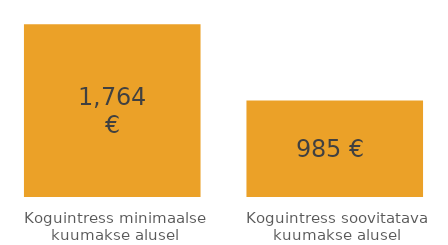
| Category | Series 0 |
|---|---|
| Koguintress minimaalse kuumakse alusel | 1763.952 |
| Koguintress soovitatava kuumakse alusel | 984.811 |